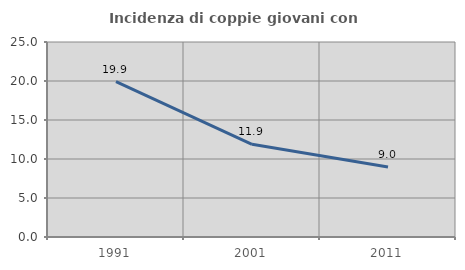
| Category | Incidenza di coppie giovani con figli |
|---|---|
| 1991.0 | 19.918 |
| 2001.0 | 11.879 |
| 2011.0 | 8.98 |